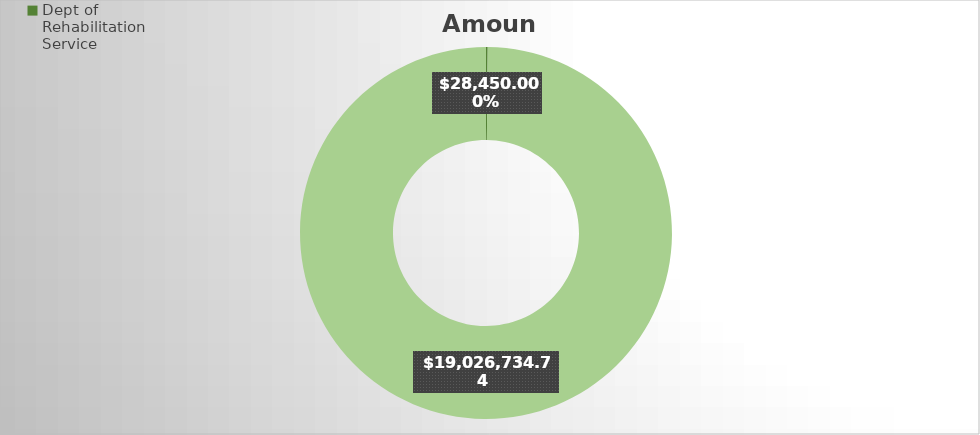
| Category | Amount |
|---|---|
| Dept of Rehabilitation Service | 28450 |
| Other | 19026734.74 |